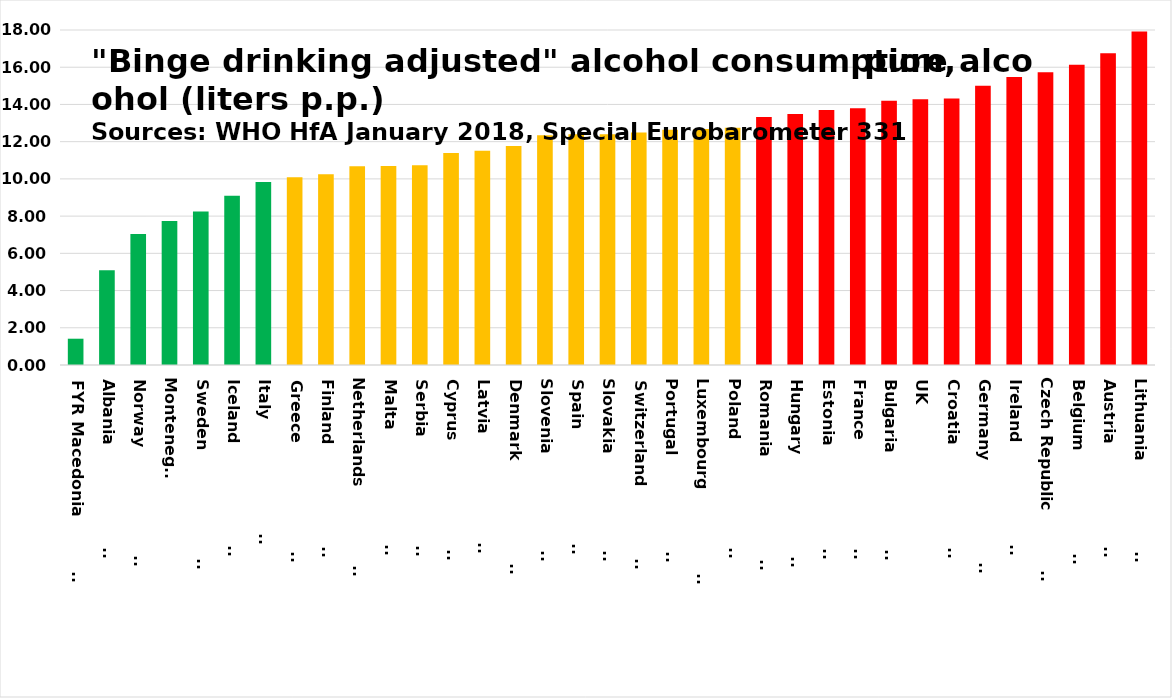
| Category | Series 0 |
|---|---|
| FYR Macedonia                | 1.412 |
| Albania                       | 5.096 |
| Norway                        | 7.045 |
| Montenegro | 7.741 |
| Sweden                        | 8.249 |
| Iceland                       | 9.089 |
| Italy                         | 9.828 |
| Greece                        | 10.09 |
| Finland                       | 10.248 |
| Netherlands                   | 10.676 |
| Malta                         | 10.697 |
| Serbia                        | 10.726 |
| Cyprus                        | 11.39 |
| Latvia                        | 11.511 |
| Denmark                       | 11.761 |
| Slovenia                      | 12.343 |
| Spain                         | 12.395 |
| Slovakia                      | 12.402 |
| Switzerland                   | 12.493 |
| Portugal                      | 12.646 |
| Luxembourg                    | 12.677 |
| Poland                        | 12.745 |
| Romania                       | 13.33 |
| Hungary                       | 13.491 |
| Estonia                       | 13.7 |
| France                        | 13.8 |
| Bulgaria                      | 14.195 |
| UK | 14.284 |
| Croatia                       | 14.325 |
| Germany                       | 15.001 |
| Ireland                       | 15.48 |
| Czech Republic                | 15.723 |
| Belgium                       | 16.128 |
| Austria                       | 16.755 |
| Lithuania                     | 17.924 |